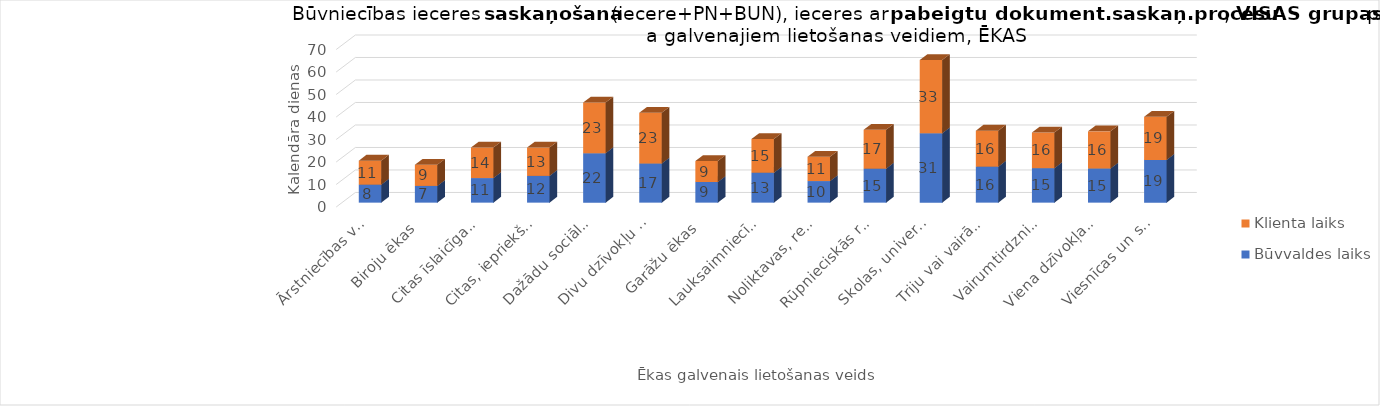
| Category | Būvvaldes laiks | Klienta laiks |
|---|---|---|
| Ārstniecības vai veselības aprūpes iestāžu ēkas | 8 | 10.667 |
| Biroju ēkas | 7.429 | 9.429 |
| Citas īslaicīgas apmešanās ēkas | 10.929 | 13.571 |
| Citas, iepriekš neklasificētas, ēkas | 11.885 | 12.596 |
| Dažādu sociālo grupu kopdzīvojamās mājas | 22 | 22.5 |
| Divu dzīvokļu mājas | 17.417 | 22.5 |
| Garāžu ēkas | 9.167 | 9.333 |
| Lauksaimniecības nedzīvojamās ēkas | 13.314 | 15 |
| Noliktavas, rezervuāri, bunkuri un silosi | 9.6 | 10.8 |
| Rūpnieciskās ražošanas ēkas | 15.1 | 17.3 |
| Skolas, universitātes un zinātniskajai pētniecībai paredzētās ēkas | 30.8 | 32.6 |
| Triju vai vairāku dzīvokļu mājas | 16 | 16 |
| Vairumtirdzniecības un mazumtirdzniecības ēkas | 15.333 | 15.833 |
| Viena dzīvokļa mājas | 15.182 | 16.499 |
| Viesnīcas un sabiedriskās ēdināšanas ēkas | 19 | 19.2 |